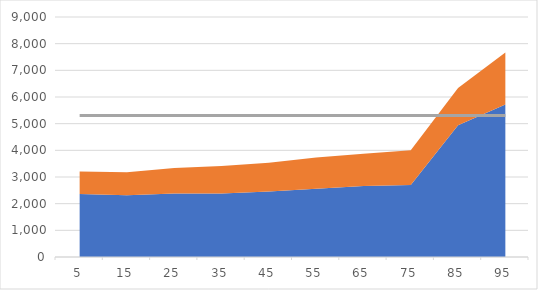
| Category | BBI |
|---|---|
| 0 | 5306.958 |
| 1 | 5306.958 |
| 2 | 5306.958 |
| 3 | 5306.958 |
| 4 | 5306.958 |
| 5 | 5306.958 |
| 6 | 5306.958 |
| 7 | 5306.958 |
| 8 | 5306.958 |
| 9 | 5306.958 |